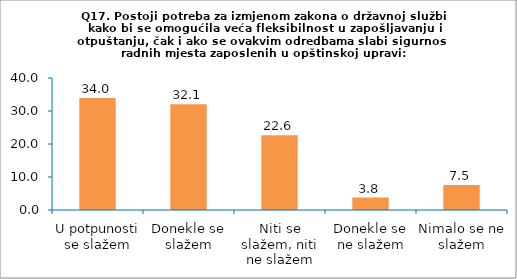
| Category | Series 0 |
|---|---|
| U potpunosti se slažem | 33.962 |
| Donekle se slažem | 32.075 |
| Niti se slažem, niti ne slažem | 22.642 |
| Donekle se ne slažem | 3.774 |
| Nimalo se ne slažem | 7.547 |